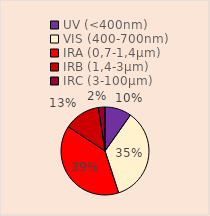
| Category | Series 0 |
|---|---|
| UV (<400nm) | 0.098 |
| VIS (400-700nm) | 0.352 |
| IRA (0,7-1,4µm) | 0.393 |
| IRB (1,4-3µm) | 0.133 |
| IRC (3-100µm) | 0.024 |